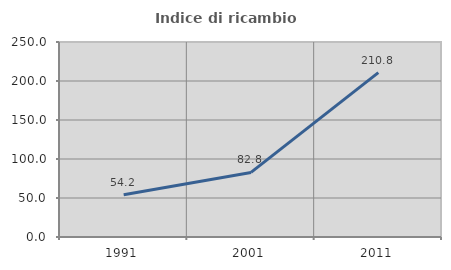
| Category | Indice di ricambio occupazionale  |
|---|---|
| 1991.0 | 54.153 |
| 2001.0 | 82.818 |
| 2011.0 | 210.778 |